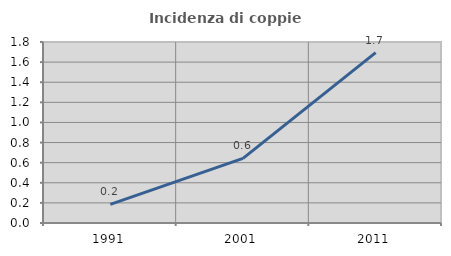
| Category | Incidenza di coppie miste |
|---|---|
| 1991.0 | 0.185 |
| 2001.0 | 0.642 |
| 2011.0 | 1.694 |